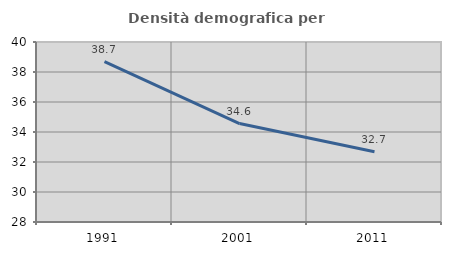
| Category | Densità demografica |
|---|---|
| 1991.0 | 38.699 |
| 2001.0 | 34.565 |
| 2011.0 | 32.683 |